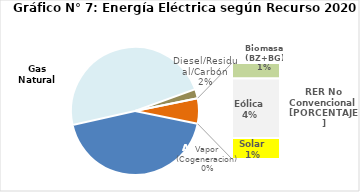
| Category | Series 0 |
|---|---|
| Agua | 1989.217 |
| Gas Natural | 2204.6 |
| Diesel/Residual/Carbón | 105.624 |
| Vapor (Cogeneracion) | 0.265 |
| Biomasa (BZ+BG) | 47.351 |
| Eólica | 183.368 |
| Solar | 64.275 |